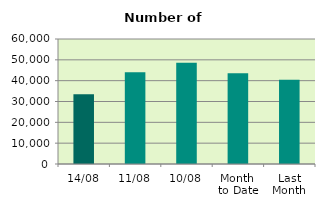
| Category | Series 0 |
|---|---|
| 14/08 | 33536 |
| 11/08 | 44082 |
| 10/08 | 48628 |
| Month 
to Date | 43518.6 |
| Last
Month | 40410.857 |